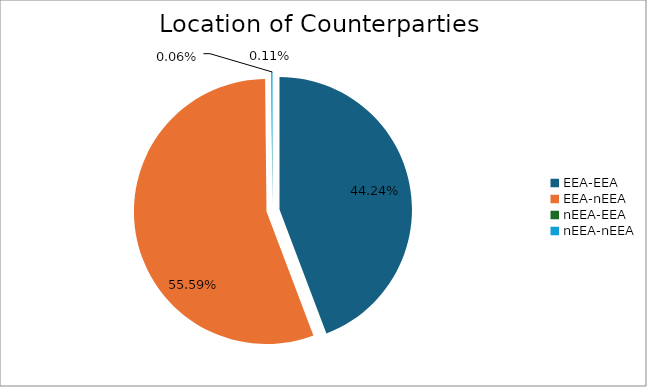
| Category | Series 0 |
|---|---|
| EEA-EEA | 6215761.554 |
| EEA-nEEA | 7810177.296 |
| nEEA-EEA | 8806.306 |
| nEEA-nEEA | 14770.795 |